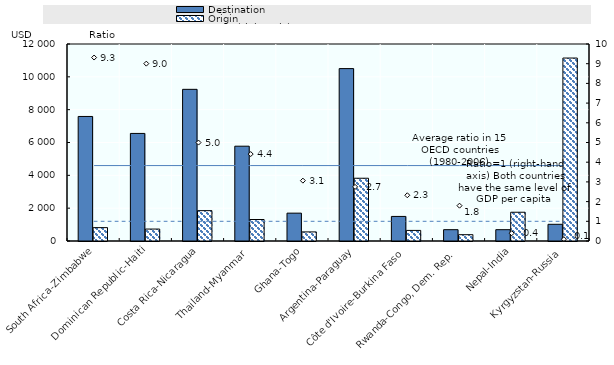
| Category | Destination | Origin |
|---|---|---|
| South Africa-Zimbabwe | 7585.758 | 814.56 |
| Dominican Republic-Haiti | 6552.694 | 727.783 |
| Costa Rica-Nicaragua | 9237.952 | 1849.029 |
| Thailand-Myanmar | 5775.137 | 1308.747 |
| Ghana-Togo | 1696.645 | 553.86 |
| Argentina-Paraguay | 10501.66 | 3822.861 |
| Côte d'Ivoire-Burkina Faso | 1496.236 | 644.609 |
| Rwanda-Congo, Dem. Rep. | 689.688 | 384.507 |
| Nepal-India | 689.514 | 1751.746 |
| Kyrgyzstan-Russia | 1017.164 | 11144.59 |